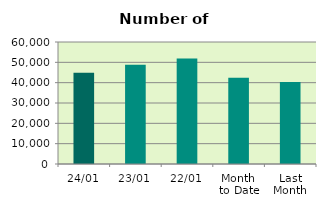
| Category | Series 0 |
|---|---|
| 24/01 | 44914 |
| 23/01 | 48856 |
| 22/01 | 51904 |
| Month 
to Date | 42432.235 |
| Last
Month | 40313.8 |